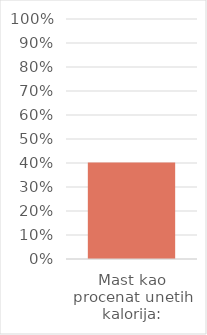
| Category | Series 0 |
|---|---|
| Mast kao procenat unetih kalorija: | 0.402 |